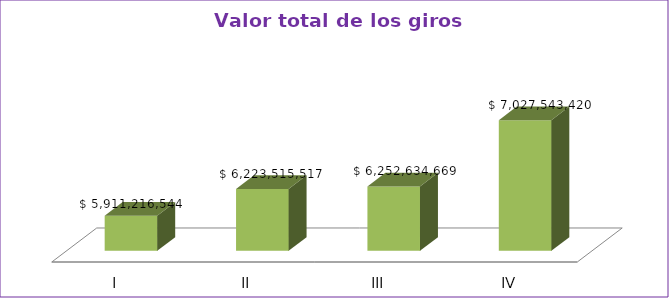
| Category | Series 0 |
|---|---|
| I | 5911216544 |
| II | 6223515517 |
| III | 6252634669 |
| IV | 7027543420 |